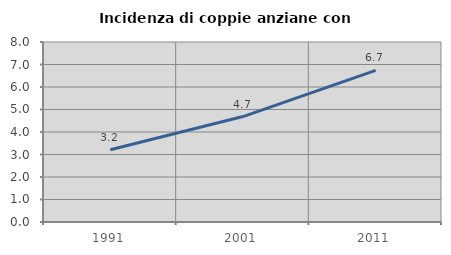
| Category | Incidenza di coppie anziane con figli |
|---|---|
| 1991.0 | 3.211 |
| 2001.0 | 4.686 |
| 2011.0 | 6.736 |